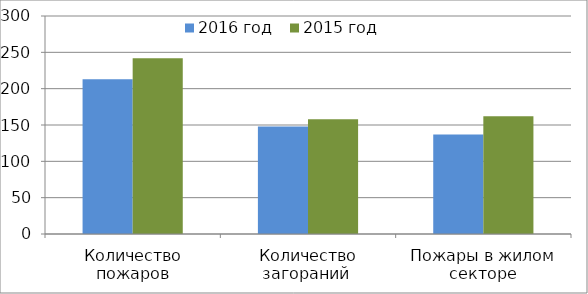
| Category | 2016 год | 2015 год |
|---|---|---|
| Количество пожаров | 213 | 242 |
| Количество загораний  | 148 | 158 |
| Пожары в жилом секторе | 137 | 162 |